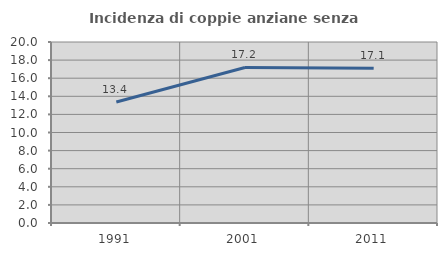
| Category | Incidenza di coppie anziane senza figli  |
|---|---|
| 1991.0 | 13.365 |
| 2001.0 | 17.187 |
| 2011.0 | 17.091 |